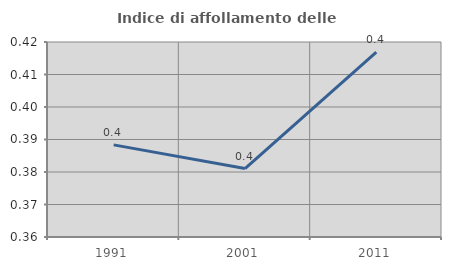
| Category | Indice di affollamento delle abitazioni  |
|---|---|
| 1991.0 | 0.388 |
| 2001.0 | 0.381 |
| 2011.0 | 0.417 |